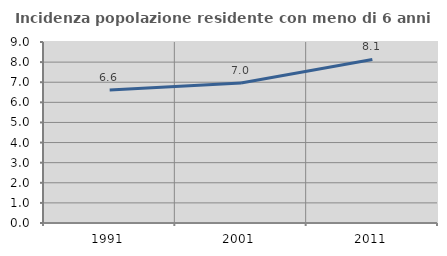
| Category | Incidenza popolazione residente con meno di 6 anni |
|---|---|
| 1991.0 | 6.616 |
| 2001.0 | 6.964 |
| 2011.0 | 8.134 |